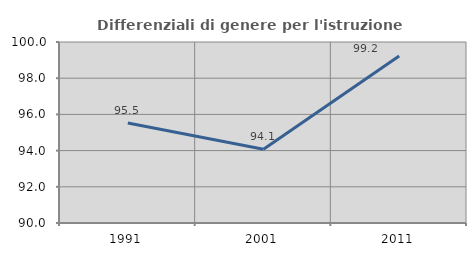
| Category | Differenziali di genere per l'istruzione superiore |
|---|---|
| 1991.0 | 95.529 |
| 2001.0 | 94.073 |
| 2011.0 | 99.232 |